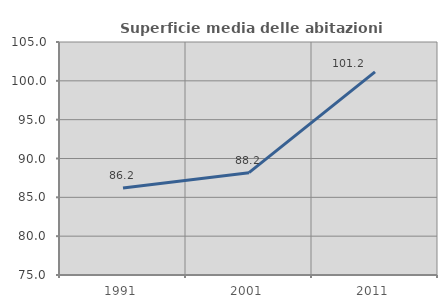
| Category | Superficie media delle abitazioni occupate |
|---|---|
| 1991.0 | 86.209 |
| 2001.0 | 88.179 |
| 2011.0 | 101.152 |